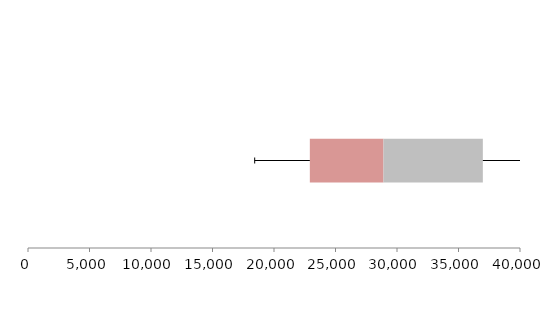
| Category | Series 1 | Series 2 | Series 3 |
|---|---|---|---|
| 0 | 22914.011 | 5984.015 | 8081.251 |